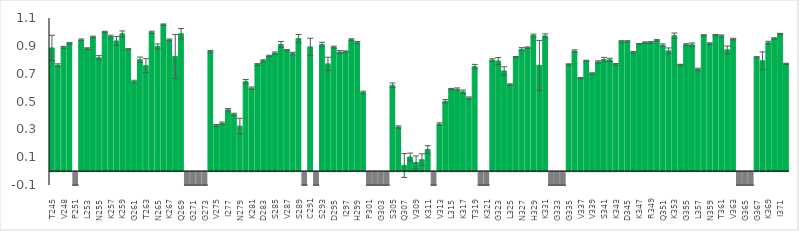
| Category | Tau_HSPB1 |
|---|---|
| T245 | 0.885 |
| A246 | 0.761 |
| V248 | 0.89 |
| M250 | 0.918 |
| P251 | -0.1 |
| D252 | 0.943 |
| L253 | 0.88 |
| K254 | 0.963 |
| N255 | 0.815 |
| V256 | 1 |
| K257 | 0.967 |
| S258 | 0.935 |
| K259 | 0.986 |
| I260 | 0.875 |
| G261 | 0.643 |
| S262 | 0.8 |
| T263 | 0.758 |
| E264 | 0.997 |
| N265 | 0.896 |
| L266 | 1.052 |
| K267 | 0.942 |
| H268 | 0.823 |
| Q269 | 0.987 |
| P270 | -0.1 |
| G271 | -0.1 |
| G272 | -0.1 |
| G273 | -0.1 |
| K274 | 0.859 |
| V275 | 0.327 |
| Q276 | 0.343 |
| I277 | 0.44 |
| I278 | 0.407 |
| N279 | 0.323 |
| K280 | 0.643 |
| K281 | 0.596 |
| L282 | 0.766 |
| D283 | 0.793 |
| L284 | 0.827 |
| S285 | 0.848 |
| N286 | 0.91 |
| V287 | 0.868 |
| Q288 | 0.844 |
| S289 | 0.952 |
| K290 | -0.1 |
| C291 | 0.892 |
| G292 | -0.1 |
| S293 | 0.909 |
| K294 | 0.77 |
| D295 | 0.89 |
| N296 | 0.855 |
| I297 | 0.858 |
| K298 | 0.945 |
| H299 | 0.924 |
| V300 | 0.565 |
| P301 | -0.1 |
| G302 | -0.1 |
| G303 | -0.1 |
| G304 | -0.1 |
| S305 | 0.616 |
| V306 | 0.317 |
| Q307 | 0.04 |
| I308 | 0.101 |
| V309 | 0.062 |
| Y310 | 0.082 |
| K311 | 0.155 |
| P312 | -0.1 |
| V313 | 0.338 |
| D314 | 0.501 |
| L315 | 0.589 |
| S316 | 0.588 |
| K317 | 0.57 |
| V318 | 0.525 |
| T319 | 0.751 |
| S320 | -0.1 |
| K321 | -0.1 |
| A322 | 0.798 |
| G323 | 0.791 |
| S324 | 0.72 |
| L325 | 0.621 |
| G326 | 0.819 |
| N327 | 0.876 |
| I328 | 0.886 |
| H329 | 0.974 |
| H330 | 0.76 |
| K331 | 0.971 |
| P332 | -0.1 |
| G333 | -0.1 |
| G334 | -0.1 |
| G335 | 0.766 |
| Q336 | 0.862 |
| V337 | 0.668 |
| E338 | 0.792 |
| V339 | 0.701 |
| K340 | 0.784 |
| S341 | 0.801 |
| E342 | 0.799 |
| K343 | 0.766 |
| L344 | 0.931 |
| D345 | 0.931 |
| F346 | 0.854 |
| K347 | 0.913 |
| D348 | 0.923 |
| R349 | 0.924 |
| V350 | 0.939 |
| Q351 | 0.904 |
| S352 | 0.864 |
| K353 | 0.973 |
| I354 | 0.764 |
| G355 | 0.908 |
| S356 | 0.908 |
| L357 | 0.73 |
| D358 | 0.976 |
| N359 | 0.916 |
| I360 | 0.976 |
| T361 | 0.971 |
| H362 | 0.871 |
| V363 | 0.948 |
| P364 | -0.1 |
| G365 | -0.1 |
| G366 | -0.1 |
| G367 | 0.817 |
| N368 | 0.793 |
| K369 | 0.923 |
| K370 | 0.953 |
| I371 | 0.986 |
| E372 | 0.77 |